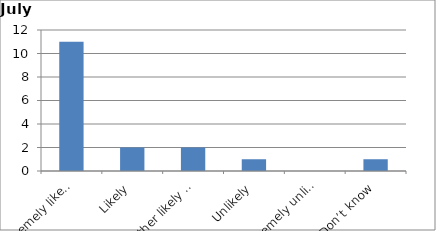
| Category | Series 0 |
|---|---|
| Extremely likely | 11 |
| Likely | 2 |
| Neither likely nor unlikely | 2 |
| Unlikely | 1 |
| Extremely unlikely | 0 |
| Don’t know | 1 |